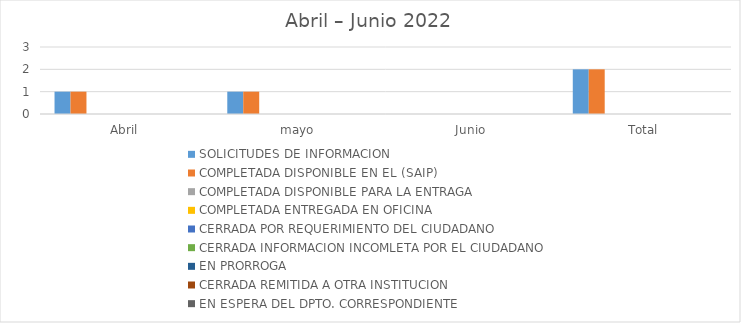
| Category | SOLICITUDES DE INFORMACION | COMPLETADA DISPONIBLE EN EL (SAIP) | COMPLETADA DISPONIBLE PARA LA ENTRAGA | COMPLETADA ENTREGADA EN OFICINA | CERRADA POR REQUERIMIENTO DEL CIUDADANO | CERRADA INFORMACION INCOMLETA POR EL CIUDADANO | EN PRORROGA | CERRADA REMITIDA A OTRA INSTITUCION | EN ESPERA DEL DPTO. CORRESPONDIENTE |
|---|---|---|---|---|---|---|---|---|---|
| Abril | 1 | 1 | 0 | 0 | 0 | 0 | 0 | 0 | 0 |
| mayo | 1 | 1 | 0 | 0 | 0 | 0 | 0 | 0 | 0 |
| Junio | 0 | 0 | 0 | 0 | 0 | 0 | 0 | 0 | 0 |
| Total | 2 | 2 | 0 | 0 | 0 | 0 | 0 | 0 | 0 |